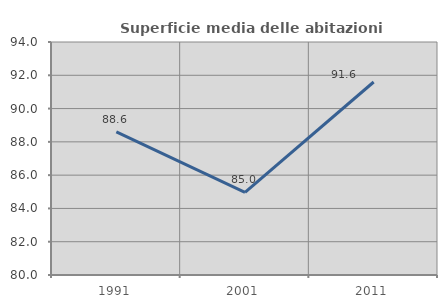
| Category | Superficie media delle abitazioni occupate |
|---|---|
| 1991.0 | 88.601 |
| 2001.0 | 84.962 |
| 2011.0 | 91.596 |